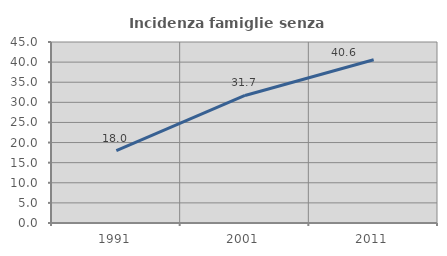
| Category | Incidenza famiglie senza nuclei |
|---|---|
| 1991.0 | 17.976 |
| 2001.0 | 31.701 |
| 2011.0 | 40.571 |